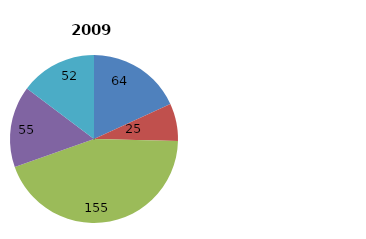
| Category | Series 0 |
|---|---|
| Material relief assistance and services | 63.79 |
| Emergency food aid | 25.323 |
| Relief co-ordination; protection and support services | 155.44 |
| Reconstruction relief and rehabilitation | 55.005 |
| Disaster prevention and preparedness | 51.753 |